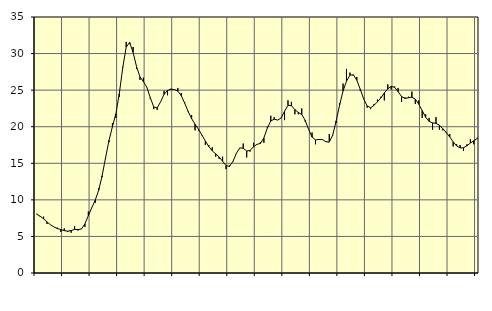
| Category | Piggar | Series 1 |
|---|---|---|
| nan | 8.1 | 8.03 |
| 87.0 | 7.7 | 7.77 |
| 87.0 | 7.7 | 7.41 |
| 87.0 | 6.7 | 6.98 |
| nan | 6.6 | 6.59 |
| 88.0 | 6.3 | 6.3 |
| 88.0 | 6.2 | 6.07 |
| 88.0 | 5.6 | 5.94 |
| nan | 6.1 | 5.79 |
| 89.0 | 5.6 | 5.72 |
| 89.0 | 5.5 | 5.81 |
| 89.0 | 6.4 | 5.96 |
| nan | 5.8 | 5.94 |
| 90.0 | 6 | 6.02 |
| 90.0 | 6.3 | 6.72 |
| 90.0 | 8.4 | 7.83 |
| nan | 8.9 | 8.93 |
| 91.0 | 9.6 | 9.96 |
| 91.0 | 11.6 | 11.31 |
| 91.0 | 13.1 | 13.29 |
| nan | 15.6 | 15.74 |
| 92.0 | 17.9 | 18.13 |
| 92.0 | 20.5 | 20.02 |
| 92.0 | 21.2 | 21.78 |
| nan | 24.1 | 24.54 |
| 93.0 | 28.2 | 28.1 |
| 93.0 | 31.6 | 30.88 |
| 93.0 | 31.3 | 31.52 |
| nan | 30.9 | 30.16 |
| 94.0 | 27.9 | 28.22 |
| 94.0 | 26.4 | 26.83 |
| 94.0 | 26.7 | 26.17 |
| nan | 25.4 | 25.38 |
| 95.0 | 23.8 | 23.96 |
| 95.0 | 22.4 | 22.71 |
| 95.0 | 22.3 | 22.57 |
| nan | 23.4 | 23.41 |
| 96.0 | 24.9 | 24.41 |
| 96.0 | 24.3 | 24.97 |
| 96.0 | 25.2 | 25.11 |
| nan | 25.1 | 25.09 |
| 97.0 | 25.3 | 24.86 |
| 97.0 | 24.6 | 24.24 |
| 97.0 | 23.3 | 23.21 |
| nan | 22 | 22.08 |
| 98.0 | 21.6 | 21.11 |
| 98.0 | 19.5 | 20.34 |
| 98.0 | 19.5 | 19.67 |
| nan | 18.8 | 18.85 |
| 99.0 | 17.5 | 18.04 |
| 99.0 | 17.5 | 17.29 |
| 99.0 | 17.2 | 16.7 |
| nan | 15.9 | 16.29 |
| 0.0 | 15.6 | 15.86 |
| 0.0 | 15.9 | 15.28 |
| 0.0 | 14.2 | 14.68 |
| nan | 14.7 | 14.58 |
| 1.0 | 15.3 | 15.24 |
| 1.0 | 16.3 | 16.35 |
| 1.0 | 17.1 | 17.11 |
| nan | 17.7 | 17.05 |
| 2.0 | 15.8 | 16.68 |
| 2.0 | 16.6 | 16.76 |
| 2.0 | 17.8 | 17.27 |
| nan | 17.6 | 17.59 |
| 3.0 | 17.9 | 17.72 |
| 3.0 | 17.8 | 18.48 |
| 3.0 | 20 | 19.8 |
| nan | 21.5 | 20.78 |
| 4.0 | 21.3 | 21.03 |
| 4.0 | 20.9 | 20.91 |
| 4.0 | 21.2 | 21.18 |
| nan | 20.9 | 22.11 |
| 5.0 | 23.6 | 22.92 |
| 5.0 | 23.4 | 22.88 |
| 5.0 | 21.7 | 22.33 |
| nan | 21.7 | 21.95 |
| 6.0 | 22.5 | 21.67 |
| 6.0 | 20.7 | 20.88 |
| 6.0 | 19.6 | 19.62 |
| nan | 19.2 | 18.58 |
| 7.0 | 17.6 | 18.2 |
| 7.0 | 18.3 | 18.25 |
| 7.0 | 18.2 | 18.24 |
| nan | 17.9 | 17.95 |
| 8.0 | 19 | 17.9 |
| 8.0 | 18.8 | 18.86 |
| 8.0 | 20.5 | 20.79 |
| nan | 23.2 | 22.95 |
| 9.0 | 25.9 | 24.87 |
| 9.0 | 27.9 | 26.22 |
| 9.0 | 27.4 | 27.05 |
| nan | 27 | 27.1 |
| 10.0 | 26.8 | 26.35 |
| 10.0 | 24.9 | 25.12 |
| 10.0 | 23.8 | 23.79 |
| nan | 22.6 | 22.85 |
| 11.0 | 22.4 | 22.59 |
| 11.0 | 23.1 | 22.93 |
| 11.0 | 23.7 | 23.41 |
| nan | 24.1 | 23.95 |
| 12.0 | 23.6 | 24.62 |
| 12.0 | 25.8 | 25.18 |
| 12.0 | 25.1 | 25.52 |
| nan | 25.5 | 25.38 |
| 13.0 | 25.3 | 24.79 |
| 13.0 | 23.4 | 24.13 |
| 13.0 | 24 | 23.87 |
| nan | 24.1 | 23.96 |
| 14.0 | 24.8 | 24.04 |
| 14.0 | 23.1 | 23.77 |
| 14.0 | 23.6 | 23.08 |
| nan | 21.2 | 22.2 |
| 15.0 | 21.7 | 21.3 |
| 15.0 | 21.2 | 20.73 |
| 15.0 | 19.6 | 20.53 |
| nan | 21.3 | 20.45 |
| 16.0 | 19.6 | 20.21 |
| 16.0 | 19.5 | 19.72 |
| 16.0 | 19.3 | 19.19 |
| nan | 19 | 18.6 |
| 17.0 | 17.3 | 17.93 |
| 17.0 | 17.6 | 17.38 |
| 17.0 | 17.5 | 17.1 |
| nan | 16.7 | 17.12 |
| 18.0 | 17.6 | 17.4 |
| 18.0 | 18.3 | 17.77 |
| 18.0 | 17.6 | 18.08 |
| nan | 18.5 | 18.39 |